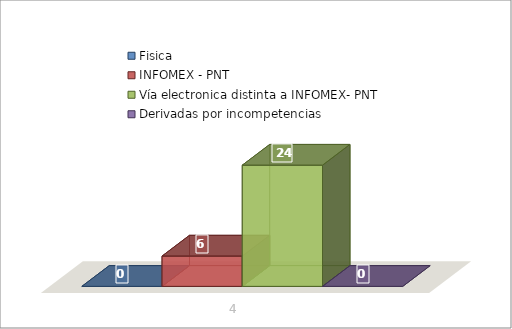
| Category | Fisica | INFOMEX - PNT | Vía electronica distinta a INFOMEX- PNT | Derivadas por incompetencias |
|---|---|---|---|---|
| 0 | 0 | 6 | 24 | 0 |